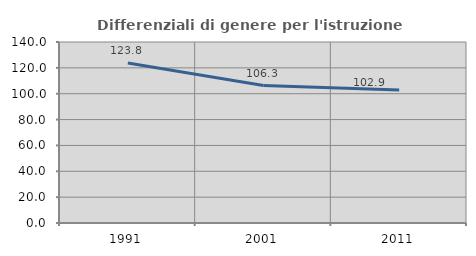
| Category | Differenziali di genere per l'istruzione superiore |
|---|---|
| 1991.0 | 123.791 |
| 2001.0 | 106.313 |
| 2011.0 | 102.947 |